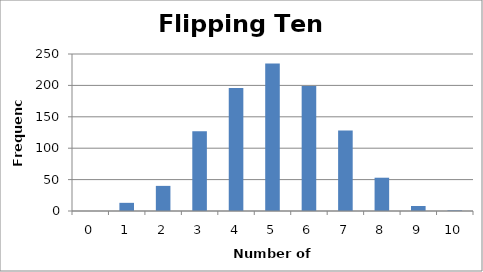
| Category | Series 0 |
|---|---|
| 0.0 | 0 |
| 1.0 | 13 |
| 2.0 | 40 |
| 3.0 | 127 |
| 4.0 | 196 |
| 5.0 | 235 |
| 6.0 | 199 |
| 7.0 | 128 |
| 8.0 | 53 |
| 9.0 | 8 |
| 10.0 | 1 |